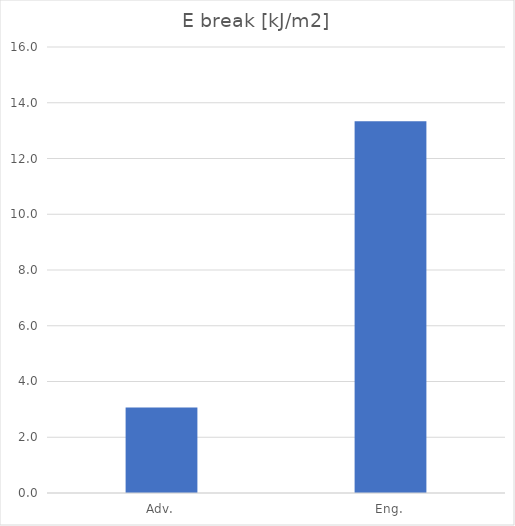
| Category | kJ/m2 |
|---|---|
| Adv. | 3.066 |
| Eng. | 13.335 |